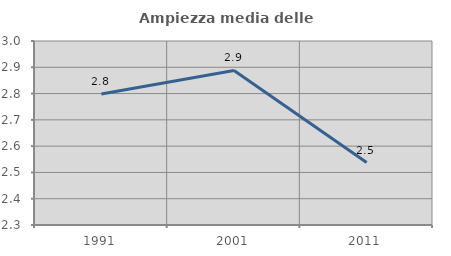
| Category | Ampiezza media delle famiglie |
|---|---|
| 1991.0 | 2.798 |
| 2001.0 | 2.888 |
| 2011.0 | 2.537 |